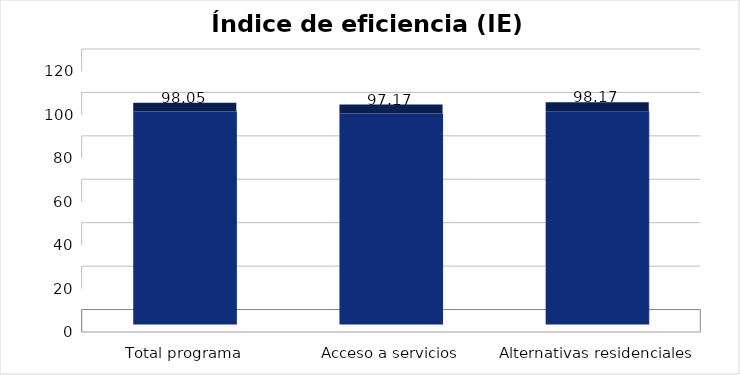
| Category | Índice de eficiencia (IE)  |
|---|---|
| Total programa | 98.051 |
| Acceso a servicios | 97.167 |
| Alternativas residenciales | 98.173 |